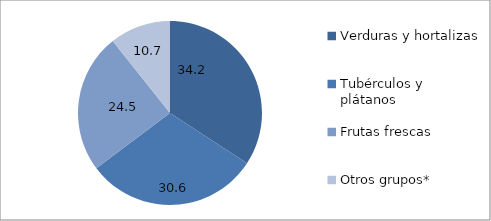
| Category | Abastecimiento mensual Bogotá |
|---|---|
| Verduras y hortalizas  | 34.211 |
| Tubérculos y plátanos  | 30.56 |
| Frutas frescas  | 24.524 |
| Otros grupos* | 10.705 |